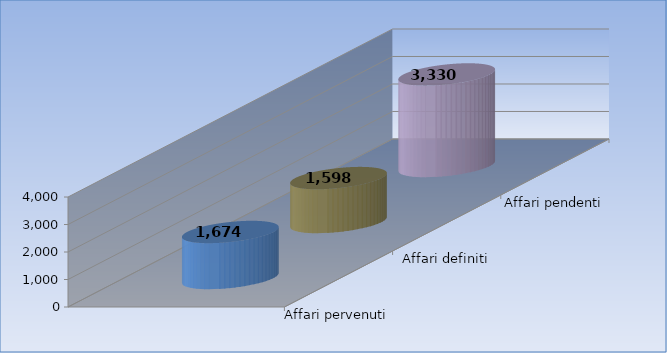
| Category | Affari pervenuti | Affari definiti | Affari pendenti |
|---|---|---|---|
| 0 | 1674 | 1598 | 3330 |